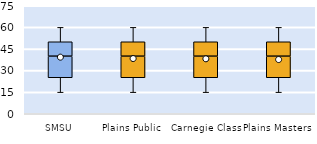
| Category | 25th | 50th | 75th |
|---|---|---|---|
| SMSU | 25 | 15 | 10 |
| Plains Public | 25 | 15 | 10 |
| Carnegie Class | 25 | 15 | 10 |
| Plains Masters | 25 | 15 | 10 |